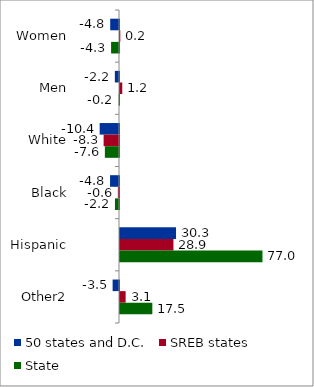
| Category | 50 states and D.C. | SREB states | State |
|---|---|---|---|
| Women | -4.757 | 0.16 | -4.275 |
| Men | -2.244 | 1.222 | -0.17 |
| White | -10.447 | -8.321 | -7.641 |
| Black | -4.834 | -0.618 | -2.183 |
| Hispanic | 30.286 | 28.888 | 77.015 |
| Other2 | -3.453 | 3.052 | 17.472 |